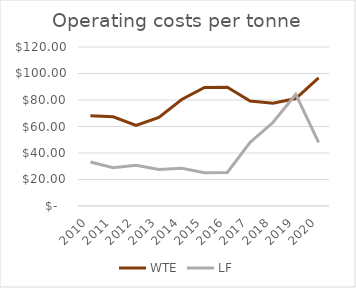
| Category | WTE | LF |
|---|---|---|
| 2010.0 | 68.062 | 33.247 |
| 2011.0 | 67.342 | 28.824 |
| 2012.0 | 60.77 | 30.805 |
| 2013.0 | 66.854 | 27.582 |
| 2014.0 | 80.371 | 28.531 |
| 2015.0 | 89.478 | 25.163 |
| 2016.0 | 89.653 | 25.322 |
| 2017.0 | 79.215 | 48.106 |
| 2018.0 | 77.501 | 62.974 |
| 2019.0 | 81.135 | 84.299 |
| 2020.0 | 96.643 | 47.969 |